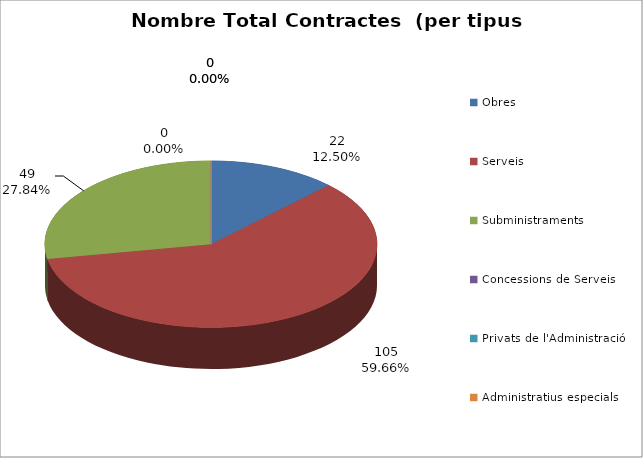
| Category | Nombre Total Contractes |
|---|---|
| Obres | 22 |
| Serveis | 105 |
| Subministraments | 49 |
| Concessions de Serveis | 0 |
| Privats de l'Administració | 0 |
| Administratius especials | 0 |